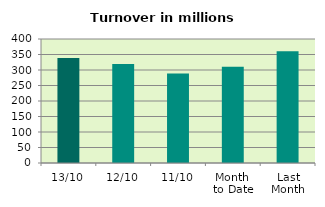
| Category | Series 0 |
|---|---|
| 13/10 | 338.88 |
| 12/10 | 319.587 |
| 11/10 | 288.953 |
| Month 
to Date | 310.541 |
| Last
Month | 360.198 |